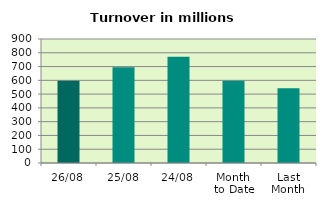
| Category | Series 0 |
|---|---|
| 26/08 | 597.211 |
| 25/08 | 694.448 |
| 24/08 | 771.285 |
| Month 
to Date | 597.208 |
| Last
Month | 542.77 |